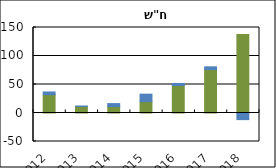
| Category | הבלאי | גידול המחזור |
|---|---|---|
| 2012.0 | 32.11 | 4.81 |
| 2013.0 | 11.467 | 0.807 |
| 2014.0 | 11.284 | 5.228 |
| 2015.0 | 19.907 | 13.15 |
| 2016.0 | 48.15 | 3.701 |
| 2017.0 | 76.229 | 4.775 |
| 2018.0 | 137.629 | -11.612 |